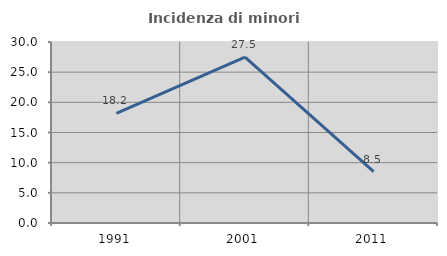
| Category | Incidenza di minori stranieri |
|---|---|
| 1991.0 | 18.182 |
| 2001.0 | 27.5 |
| 2011.0 | 8.511 |